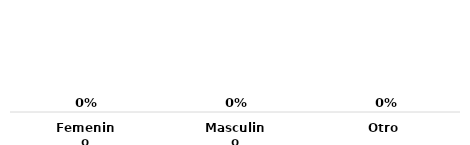
| Category | Series 0 |
|---|---|
| Femenino | 0 |
| Masculino | 0 |
| Otro | 0 |